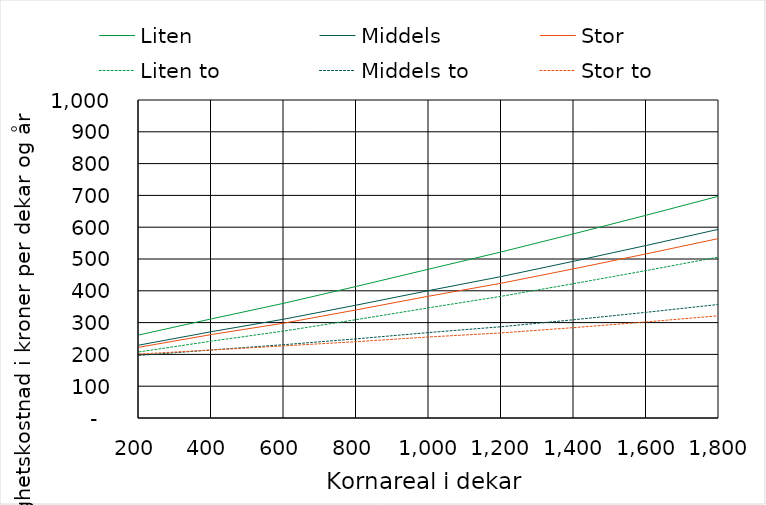
| Category | Liten | Middels | Stor | Liten to | Middels to | Stor to |
|---|---|---|---|---|---|---|
| 200.0 | 261.181 | 229.222 | 222.496 | 207.785 | 196.823 | 201.037 |
| 400.0 | 311.741 | 271.452 | 262.507 | 241.655 | 214.031 | 213.808 |
| 600.0 | 360.917 | 310.84 | 298.426 | 273.58 | 230.567 | 226.763 |
| 800.0 | 413.886 | 355.085 | 340.127 | 309.422 | 248.96 | 240.07 |
| 1000.0 | 468.278 | 400.751 | 383.251 | 346.687 | 268.776 | 254.799 |
| 1200.0 | 522.358 | 444.974 | 423.957 | 382.876 | 287.107 | 267.653 |
| 1400.0 | 579.41 | 493.13 | 469.424 | 422.617 | 309.055 | 284.223 |
| 1600.0 | 637.884 | 542.708 | 516.313 | 463.779 | 332.425 | 302.215 |
| 1800.0 | 697.781 | 593.708 | 564.624 | 506.365 | 357.218 | 321.63 |